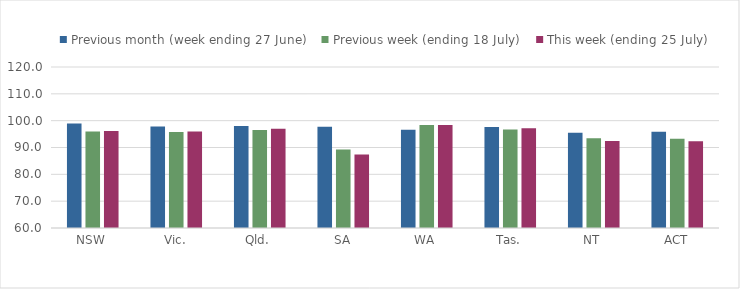
| Category | Previous month (week ending 27 June) | Previous week (ending 18 July) | This week (ending 25 July) |
|---|---|---|---|
| NSW | 98.91 | 95.973 | 96.165 |
| Vic. | 97.868 | 95.767 | 95.978 |
| Qld. | 98.02 | 96.504 | 96.954 |
| SA | 97.724 | 89.301 | 87.378 |
| WA | 96.659 | 98.42 | 98.415 |
| Tas. | 97.648 | 96.753 | 97.146 |
| NT | 95.463 | 93.474 | 92.428 |
| ACT | 95.863 | 93.224 | 92.324 |